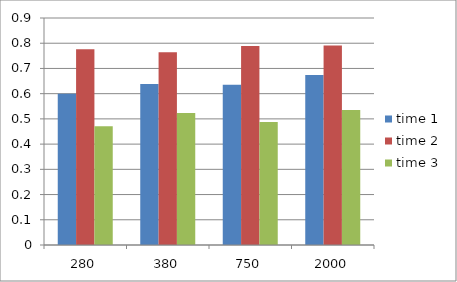
| Category | time 1 | time 2 | time 3 |
|---|---|---|---|
| 280.0 | 0.599 | 0.776 | 0.47 |
| 380.0 | 0.638 | 0.764 | 0.524 |
| 750.0 | 0.636 | 0.789 | 0.488 |
| 2000.0 | 0.674 | 0.791 | 0.535 |